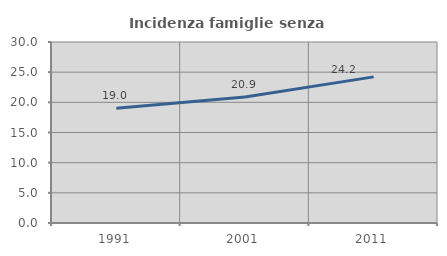
| Category | Incidenza famiglie senza nuclei |
|---|---|
| 1991.0 | 19.036 |
| 2001.0 | 20.887 |
| 2011.0 | 24.218 |